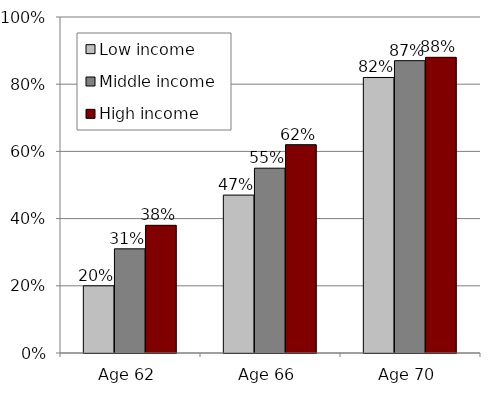
| Category | Low income | Middle income | High income |
|---|---|---|---|
| Age 62 | 0.2 | 0.31 | 0.38 |
| Age 66 | 0.47 | 0.55 | 0.62 |
| Age 70 | 0.82 | 0.87 | 0.88 |